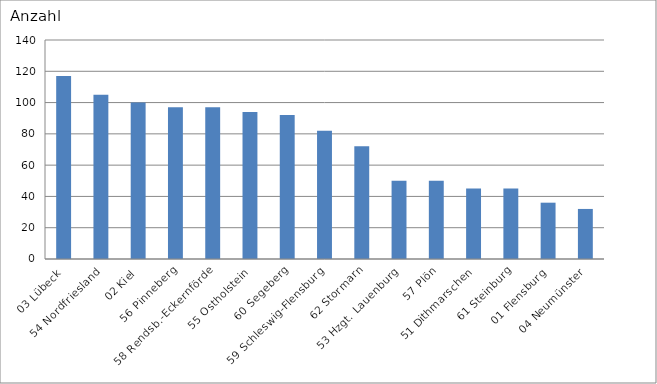
| Category | 03 Lübeck 54 Nordfriesland 02 Kiel 56 Pinneberg 58 Rendsb.-Eckernförde 55 Ostholstein 60 Segeberg 59 Schleswig-Flensburg 62 Stormarn 53 Hzgt. Lauenburg 57 Plön 51 Dithmarschen 61 Steinburg 01 Flensburg 04 Neumünster |
|---|---|
| 03 Lübeck | 117 |
| 54 Nordfriesland | 105 |
| 02 Kiel | 100 |
| 56 Pinneberg | 97 |
| 58 Rendsb.-Eckernförde | 97 |
| 55 Ostholstein | 94 |
| 60 Segeberg | 92 |
| 59 Schleswig-Flensburg | 82 |
| 62 Stormarn | 72 |
| 53 Hzgt. Lauenburg | 50 |
| 57 Plön | 50 |
| 51 Dithmarschen | 45 |
| 61 Steinburg | 45 |
| 01 Flensburg | 36 |
| 04 Neumünster | 32 |